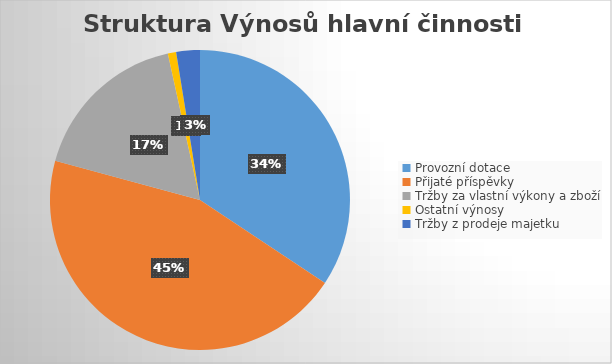
| Category | Series 0 |
|---|---|
| Provozní dotace | 15825 |
| Přijaté příspěvky | 20683 |
| Tržby za vlastní výkony a zboží | 7997 |
| Ostatní výnosy | 413 |
| Tržby z prodeje majetku | 1174 |